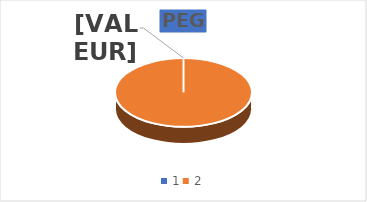
| Category | PEG |
|---|---|
| 0 | 0 |
| 1 | 1 |